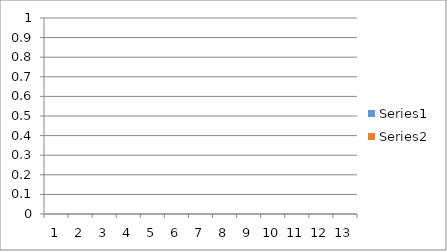
| Category | Series 0 | Series 1 |
|---|---|---|
| 0 | 15 | 15 |
| 1 | 15 | 15 |
| 2 | 14 | 14 |
| 3 | 13 | 13 |
| 4 | 13 | 12 |
| 5 | 14 | 14 |
| 6 | 14 | 13 |
| 7 | 15 | 14 |
| 8 | 15 | 15 |
| 9 | 13 | 13 |
| 10 | 15 | 15 |
| 11 | 13 | 14 |
| 12 | 169 | 167 |